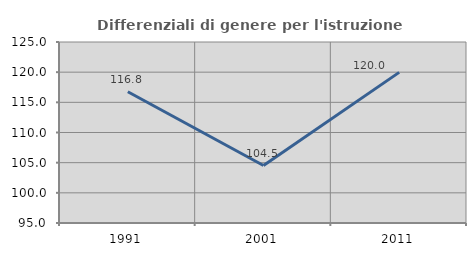
| Category | Differenziali di genere per l'istruzione superiore |
|---|---|
| 1991.0 | 116.755 |
| 2001.0 | 104.521 |
| 2011.0 | 119.965 |